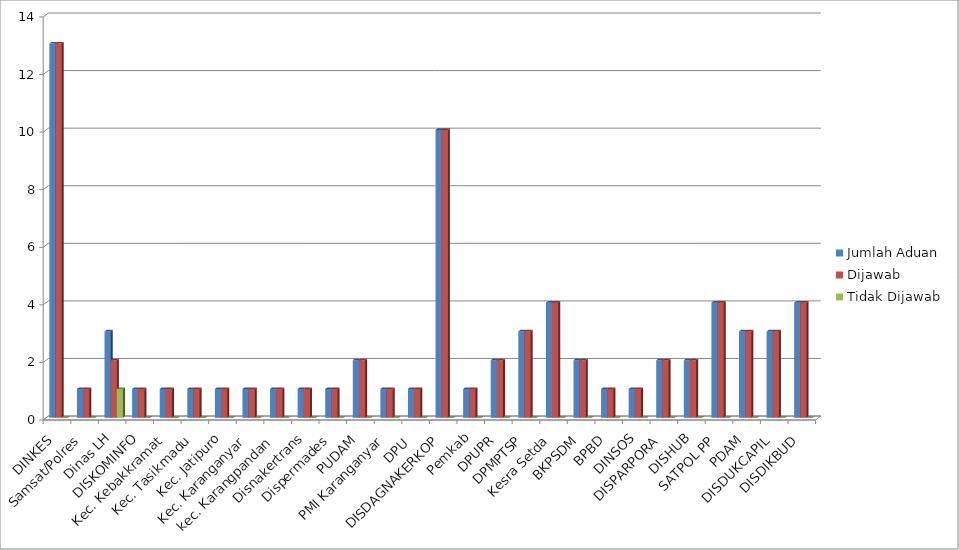
| Category | Jumlah Aduan | Dijawab | Tidak Dijawab |
|---|---|---|---|
| DINKES | 13 | 13 | 0 |
| Samsat/Polres  | 1 | 1 | 0 |
| Dinas LH | 3 | 2 | 1 |
| DISKOMINFO | 1 | 1 | 0 |
| Kec. Kebakkramat | 1 | 1 | 0 |
| Kec. Tasikmadu | 1 | 1 | 0 |
| Kec. Jatipuro | 1 | 1 | 0 |
| Kec. Karanganyar | 1 | 1 | 0 |
| kec. Karangpandan | 1 | 1 | 0 |
| Disnakertrans | 1 | 1 | 0 |
| Dispermades | 1 | 1 | 0 |
| PUDAM | 2 | 2 | 0 |
| PMI Karanganyar | 1 | 1 | 0 |
| DPU  | 1 | 1 | 0 |
| DISDAGNAKERKOP | 10 | 10 | 0 |
| Pemkab | 1 | 1 | 0 |
| DPUPR | 2 | 2 | 0 |
| DPMPTSP | 3 | 3 | 0 |
| Kesra Setda | 4 | 4 | 0 |
| BKPSDM | 2 | 2 | 0 |
| BPBD | 1 | 1 | 0 |
| DINSOS | 1 | 1 | 0 |
| DISPARPORA | 2 | 2 | 0 |
| DISHUB | 2 | 2 | 0 |
| SATPOL PP | 4 | 4 | 0 |
| PDAM | 3 | 3 | 0 |
| DISDUKCAPIL | 3 | 3 | 0 |
| DISDIKBUD | 4 | 4 | 0 |